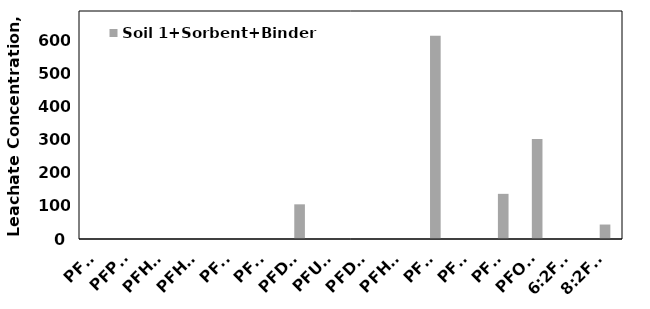
| Category | Soil 1+Sorbent+Binder |
|---|---|
| PFBA | 0 |
| PFPeA | 0 |
| PFHxA | 0 |
| PFHpA | 0 |
| PFOA | 0 |
| PFNA | 0 |
| PFDA | 104.938 |
| PFUnA | 0 |
| PFDoA | 0 |
| PFHxS | 0 |
| PFOS | 615.017 |
| PFNS | 0 |
| PFDS | 136.629 |
| PFOSA | 302.408 |
| 6:2FTS | 0 |
| 8:2FTS | 43.782 |